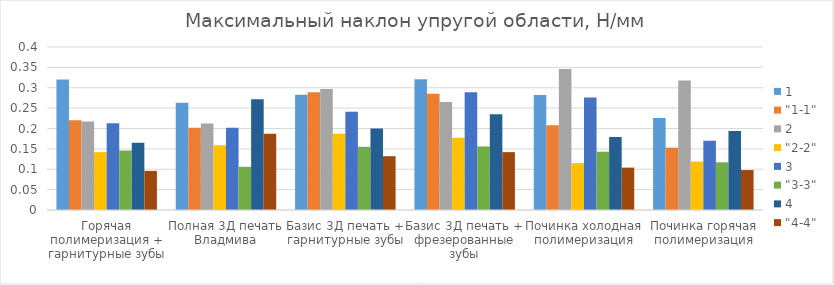
| Category | 1 | "1-1" | 2 | "2-2" | 3 | "3-3" | 4 | "4-4" |
|---|---|---|---|---|---|---|---|---|
| Горячая полимеризация + гарнитурные зубы | 0.32 | 0.22 | 0.217 | 0.142 | 0.213 | 0.146 | 0.165 | 0.096 |
| Полная 3Д печать Владмива | 0.263 | 0.202 | 0.212 | 0.159 | 0.202 | 0.106 | 0.272 | 0.187 |
| Базис 3Д печать + гарнитурные зубы | 0.283 | 0.289 | 0.297 | 0.187 | 0.241 | 0.155 | 0.2 | 0.132 |
| Базис 3Д печать + фрезерованные зубы | 0.321 | 0.285 | 0.265 | 0.177 | 0.289 | 0.156 | 0.235 | 0.142 |
| Починка холодная полимеризация | 0.282 | 0.208 | 0.346 | 0.115 | 0.276 | 0.143 | 0.179 | 0.104 |
| Починка горячая полимеризация | 0.226 | 0.153 | 0.318 | 0.119 | 0.17 | 0.117 | 0.194 | 0.098 |